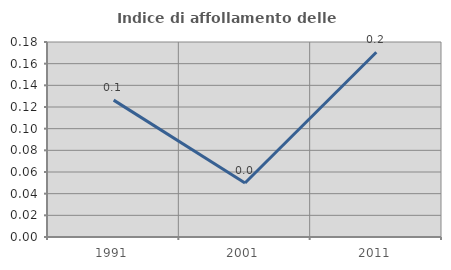
| Category | Indice di affollamento delle abitazioni  |
|---|---|
| 1991.0 | 0.126 |
| 2001.0 | 0.05 |
| 2011.0 | 0.171 |